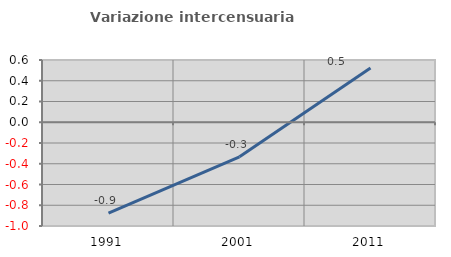
| Category | Variazione intercensuaria annua |
|---|---|
| 1991.0 | -0.877 |
| 2001.0 | -0.334 |
| 2011.0 | 0.523 |